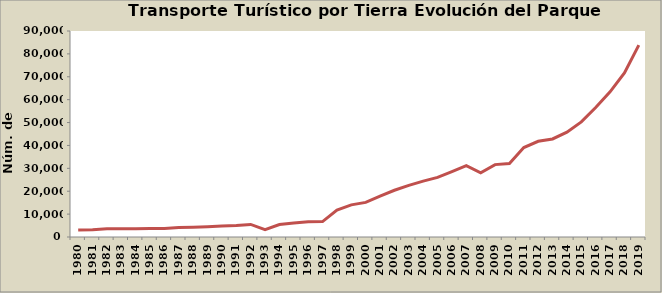
| Category | Series 0 |
|---|---|
| 1980.0 | 3070 |
| 1981.0 | 3150 |
| 1982.0 | 3550 |
| 1983.0 | 3589 |
| 1984.0 | 3596 |
| 1985.0 | 3674 |
| 1986.0 | 3718 |
| 1987.0 | 4127 |
| 1988.0 | 4266 |
| 1989.0 | 4476 |
| 1990.0 | 4782 |
| 1991.0 | 5005 |
| 1992.0 | 5481 |
| 1993.0 | 3240 |
| 1994.0 | 5476 |
| 1995.0 | 6137 |
| 1996.0 | 6706 |
| 1997.0 | 6729 |
| 1998.0 | 11793 |
| 1999.0 | 14048 |
| 2000.0 | 15124 |
| 2001.0 | 17889 |
| 2002.0 | 20424 |
| 2003.0 | 22561 |
| 2004.0 | 24419 |
| 2005.0 | 26044 |
| 2006.0 | 28579 |
| 2007.0 | 31203 |
| 2008.0 | 28008 |
| 2009.0 | 31619 |
| 2010.0 | 32105 |
| 2011.0 | 39093 |
| 2012.0 | 41813 |
| 2013.0 | 42836 |
| 2014.0 | 45817 |
| 2015.0 | 50284 |
| 2016.0 | 56598 |
| 2017.0 | 63420 |
| 2018.0 | 71716 |
| 2019.0 | 83855 |